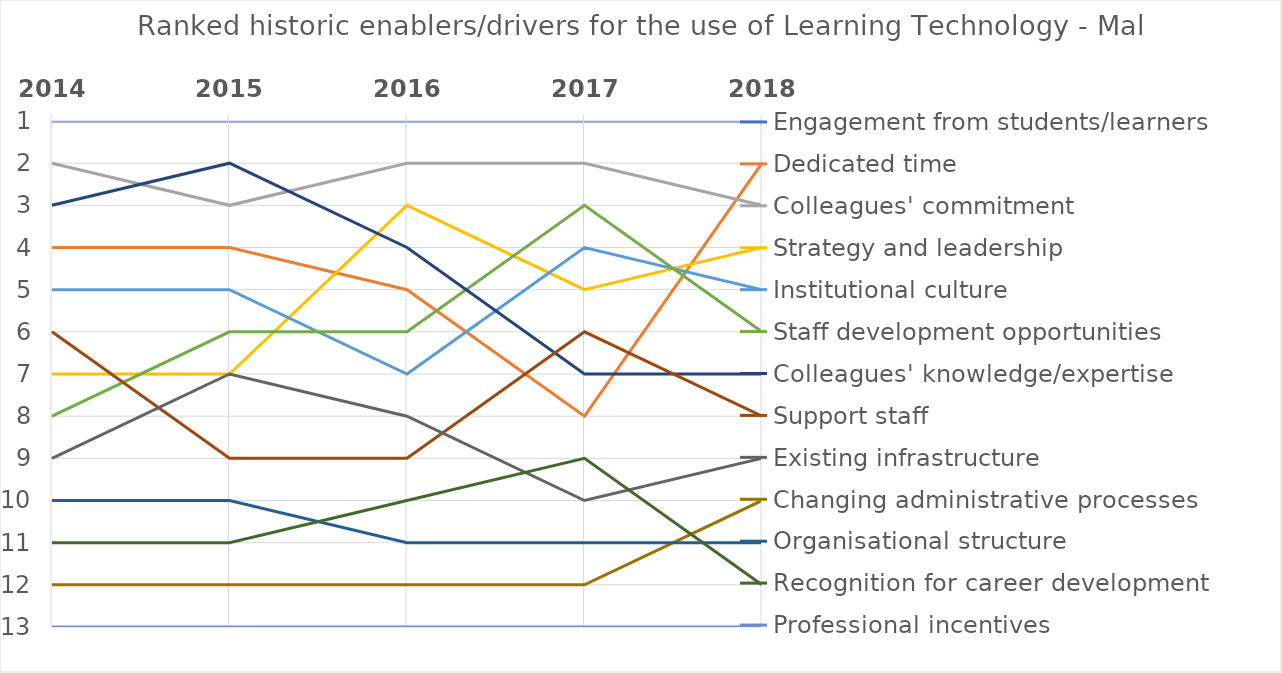
| Category | Engagement from students/learners | Dedicated time | Colleagues' commitment | Strategy and leadership | Institutional culture | Staff development opportunities | Colleagues' knowledge/expertise | Support staff | Existing infrastructure | Changing administrative processes | Organisational structure | Recognition for career development | Professional incentives |
|---|---|---|---|---|---|---|---|---|---|---|---|---|---|
| 2014.0 | 1 | 4 | 2 | 7 | 5 | 8 | 3 | 6 | 9 | 12 | 10 | 11 | 13 |
| 2015.0 | 1 | 4 | 3 | 7 | 5 | 6 | 2 | 9 | 7 | 12 | 10 | 11 | 13 |
| 2016.0 | 1 | 5 | 2 | 3 | 7 | 6 | 4 | 9 | 8 | 12 | 11 | 10 | 13 |
| 2017.0 | 1 | 8 | 2 | 5 | 4 | 3 | 7 | 6 | 10 | 12 | 11 | 9 | 13 |
| 2018.0 | 1 | 2 | 3 | 4 | 5 | 6 | 7 | 8 | 9 | 10 | 11 | 12 | 13 |